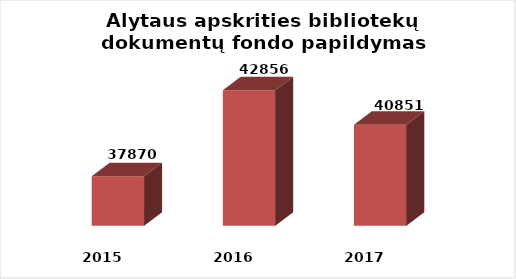
| Category | Series 0 |
|---|---|
| 2015.0 | 37870 |
| 2016.0 | 42856 |
| 2017.0 | 40851 |